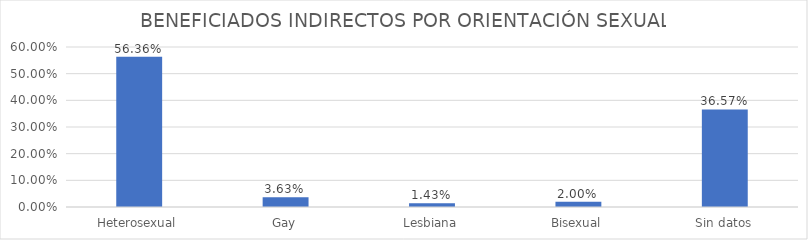
| Category | % |
|---|---|
| Heterosexual | 0.564 |
| Gay | 0.036 |
| Lesbiana | 0.014 |
| Bisexual | 0.02 |
| Sin datos | 0.366 |